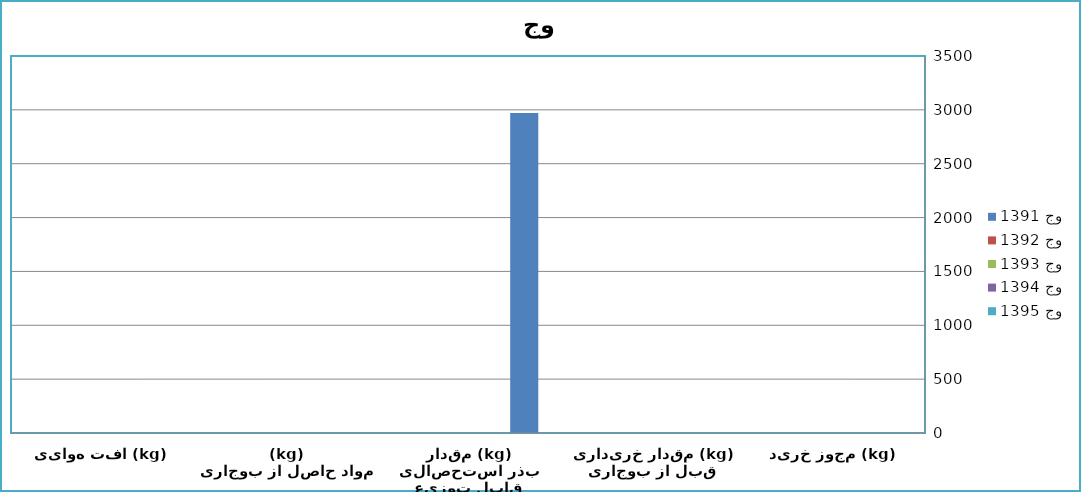
| Category | 1391 جو | 1392 جو | 1393 جو | 1394 جو | 1395 جو |
|---|---|---|---|---|---|
| مجوز خرید (kg) | 0 | 0 | 0 | 0 | 0 |
| مقدار خریداری قبل از بوجاری (kg) | 0 | 0 | 0 | 0 | 0 |
| مقدار بذر استحصالی قابل توزیع (kg) | 2970 | 0 | 0 | 0 | 0 |
| مواد حاصل از بوجاری (kg) | 0 | 0 | 0 | 0 | 0 |
| افت هوایی (kg) | 0 | 0 | 0 | 0 | 0 |